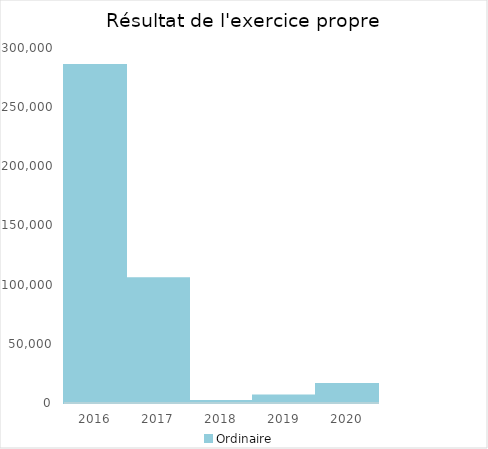
| Category |   | Ordinaire |    |
|---|---|---|---|
| 2016.0 |  | 285659.34 |  |
| 2017.0 |  | 105412.93 |  |
| 2018.0 |  | 1733.81 |  |
| 2019.0 |  | 6351.38 |  |
| 2020.0 |  | 16090.44 |  |